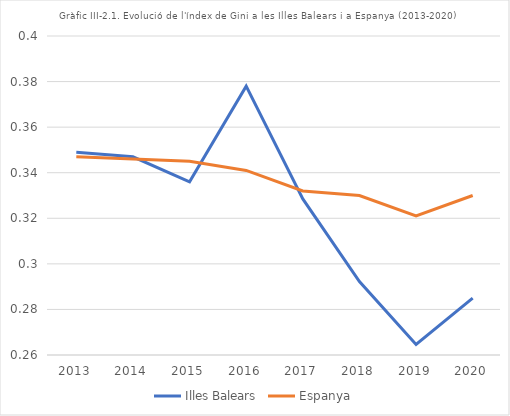
| Category | Illes Balears | Espanya |
|---|---|---|
| 2013.0 | 0.349 | 0.347 |
| 2014.0 | 0.347 | 0.346 |
| 2015.0 | 0.336 | 0.345 |
| 2016.0 | 0.378 | 0.341 |
| 2017.0 | 0.328 | 0.332 |
| 2018.0 | 0.292 | 0.33 |
| 2019.0 | 0.265 | 0.321 |
| 2020.0 | 0.285 | 0.33 |